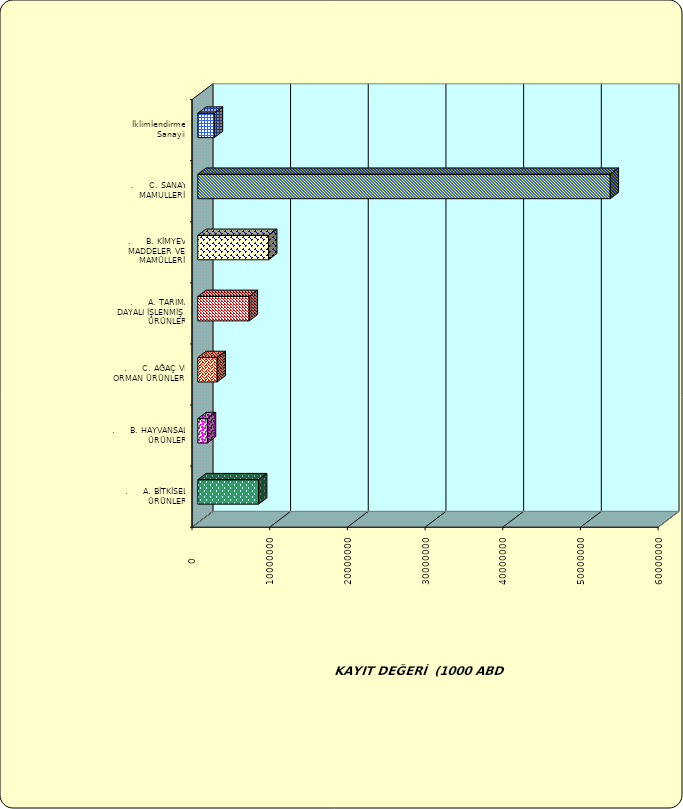
| Category | Series 0 |
|---|---|
| .     A. BİTKİSEL ÜRÜNLER | 7819605.282 |
| .     B. HAYVANSAL ÜRÜNLER | 1231905.683 |
| .     C. AĞAÇ VE ORMAN ÜRÜNLERİ | 2487904.173 |
| .     A. TARIMA DAYALI İŞLENMİŞ ÜRÜNLER | 6616318.535 |
| .     B. KİMYEVİ MADDELER VE MAMÜLLERİ | 9104995.324 |
| .     C. SANAYİ MAMULLERİ | 53087972.692 |
|  İklimlendirme Sanayii | 2123538.761 |